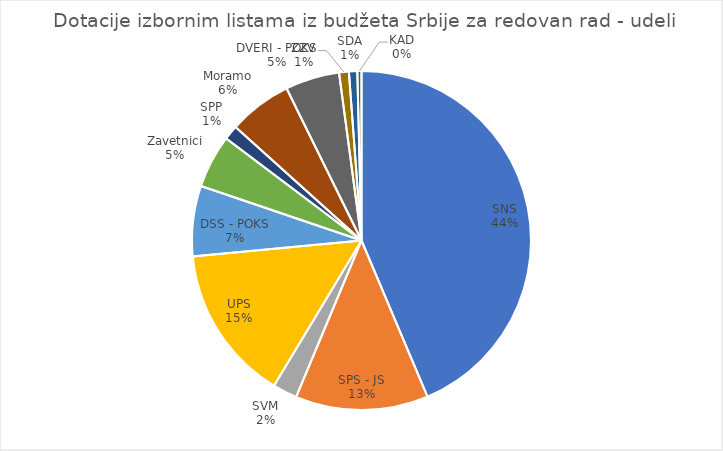
| Category | Series 2 |
|---|---|
| SNS | 603822158.397 |
| SPS - JS | 175260870.213 |
| SVM | 32314379.787 |
| UPS | 205691940.249 |
| DSS - POKS | 92812440.836 |
| Zavetnici | 70232254.729 |
| SPP | 19207642.057 |
| Moramo | 83628848.369 |
| DVERI - POKS | 71494904.932 |
| ZZV | 12871531.179 |
| SDA | 11011845.668 |
| KAD | 5446183.585 |